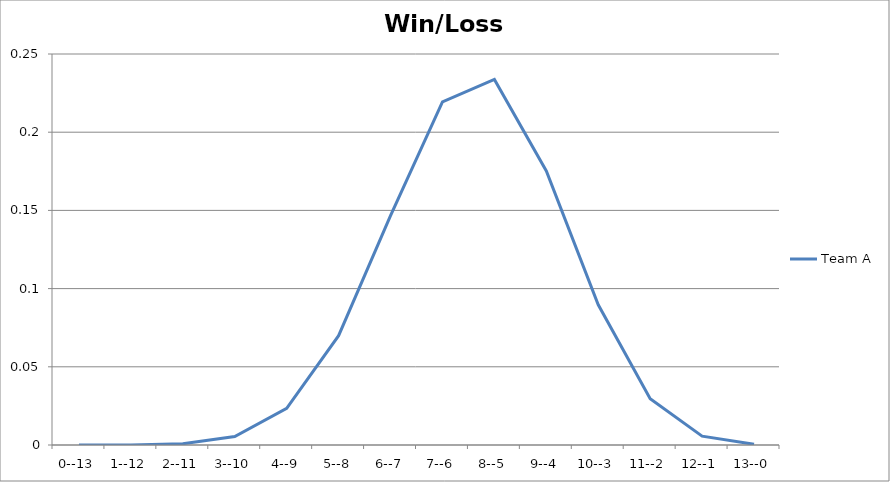
| Category | Team A |
|---|---|
| 0--13 | 0 |
| 1--12 | 0 |
| 2--11 | 0.001 |
| 3--10 | 0.005 |
| 4--9 | 0.023 |
| 5--8 | 0.07 |
| 6--7 | 0.147 |
| 7--6 | 0.219 |
| 8--5 | 0.234 |
| 9--4 | 0.175 |
| 10--3 | 0.09 |
| 11--2 | 0.03 |
| 12--1 | 0.006 |
| 13--0 | 0 |